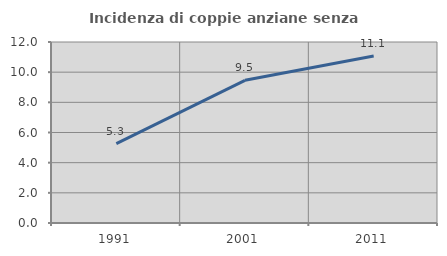
| Category | Incidenza di coppie anziane senza figli  |
|---|---|
| 1991.0 | 5.263 |
| 2001.0 | 9.459 |
| 2011.0 | 11.067 |